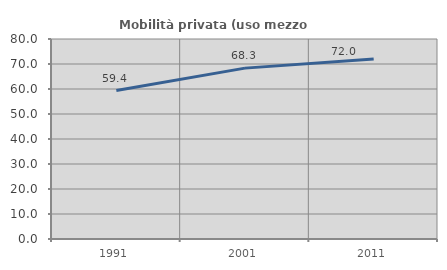
| Category | Mobilità privata (uso mezzo privato) |
|---|---|
| 1991.0 | 59.361 |
| 2001.0 | 68.349 |
| 2011.0 | 72.005 |